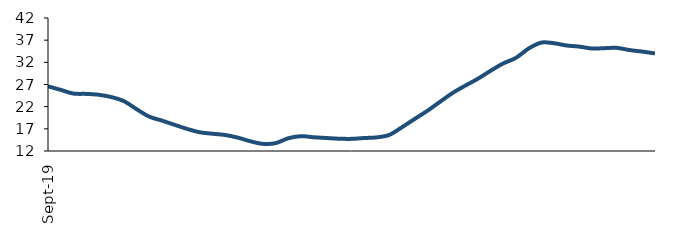
| Category | Series 0 |
|---|---|
| 2019-09-01 | 26.594 |
| 2019-10-01 | 25.793 |
| 2019-11-01 | 24.956 |
| 2019-12-01 | 24.882 |
| 2020-01-01 | 24.685 |
| 2020-02-01 | 24.173 |
| 2020-03-01 | 23.249 |
| 2020-04-01 | 21.444 |
| 2020-05-01 | 19.761 |
| 2020-06-01 | 18.865 |
| 2020-07-01 | 17.917 |
| 2020-08-01 | 16.982 |
| 2020-09-01 | 16.225 |
| 2020-10-01 | 15.898 |
| 2020-11-01 | 15.612 |
| 2020-12-01 | 15.02 |
| 2021-01-01 | 14.199 |
| 2021-02-01 | 13.61 |
| 2021-03-01 | 13.772 |
| 2021-04-01 | 14.873 |
| 2021-05-01 | 15.345 |
| 2021-06-01 | 15.098 |
| 2021-07-01 | 14.935 |
| 2021-08-01 | 14.77 |
| 2021-09-01 | 14.738 |
| 2021-10-01 | 14.927 |
| 2021-11-01 | 15.076 |
| 2021-12-01 | 15.646 |
| 2022-01-01 | 17.378 |
| 2022-02-01 | 19.236 |
| 2022-03-01 | 21.066 |
| 2022-04-01 | 23.099 |
| 2022-05-01 | 25.101 |
| 2022-06-01 | 26.747 |
| 2022-07-01 | 28.308 |
| 2022-08-01 | 30.099 |
| 2022-09-01 | 31.754 |
| 2022-10-01 | 33.005 |
| 2022-11-01 | 35.104 |
| 2022-12-01 | 36.448 |
| 2023-01-01 | 36.313 |
| 2023-02-01 | 35.8 |
| 2023-03-01 | 35.553 |
| 2023-04-01 | 35.126 |
| 2023-05-01 | 35.194 |
| 2023-06-01 | 35.259 |
| 2023-07-01 | 34.763 |
| 2023-08-01 | 34.422 |
| 2023-09-01 | 34.006 |